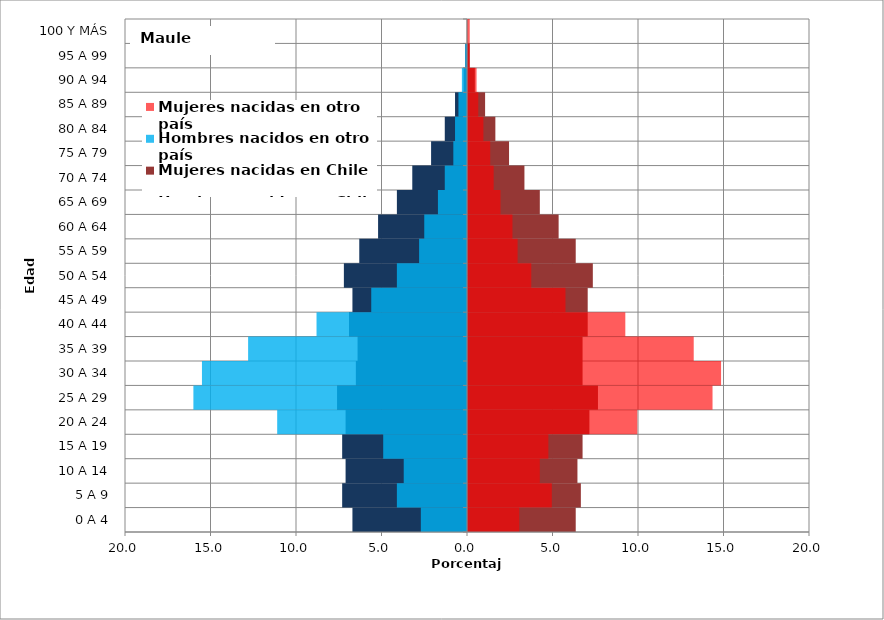
| Category | Hombres nacidos en Chile | Mujeres nacidas en Chile | Hombres nacidos en otro país | Mujeres nacidas en otro país |
|---|---|---|---|---|
| 0 A 4 | -6.7 | 6.3 | -2.7 | 3 |
| 5 A 9 | -7.3 | 6.6 | -4.1 | 4.9 |
| 10 A 14 | -7.1 | 6.4 | -3.7 | 4.2 |
| 15 A 19 | -7.3 | 6.7 | -4.9 | 4.7 |
| 20 A 24 | -7.1 | 7.1 | -11.1 | 9.9 |
| 25 A 29 | -7.6 | 7.6 | -16 | 14.3 |
| 30 A 34 | -6.5 | 6.7 | -15.5 | 14.8 |
| 35 A 39 | -6.4 | 6.7 | -12.8 | 13.2 |
| 40 A 44 | -6.9 | 7 | -8.8 | 9.2 |
| 45 A 49 | -6.7 | 7 | -5.6 | 5.7 |
| 50 A 54 | -7.2 | 7.3 | -4.1 | 3.7 |
| 55 A 59 | -6.3 | 6.3 | -2.8 | 2.9 |
| 60 A 64 | -5.2 | 5.3 | -2.5 | 2.6 |
| 65 A 69 | -4.1 | 4.2 | -1.7 | 1.9 |
| 70 A 74 | -3.2 | 3.3 | -1.3 | 1.5 |
| 75 A 79 | -2.1 | 2.4 | -0.8 | 1.3 |
| 80 A 84 | -1.3 | 1.6 | -0.7 | 0.9 |
| 85 A 89 | -0.7 | 1 | -0.5 | 0.6 |
| 90 A 94 | -0.2 | 0.4 | -0.3 | 0.5 |
| 95 A 99 | -0.1 | 0.1 | -0.1 | 0.1 |
| 100 Y MÁS | 0 | 0 | 0 | 0.1 |